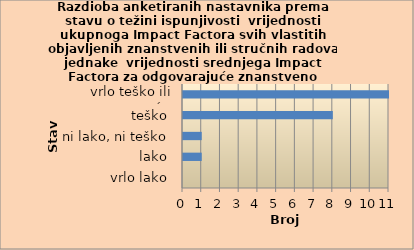
| Category | Series 0 |
|---|---|
| vrlo lako | 0 |
| lako | 1 |
| ni lako, ni teško | 1 |
| teško | 8 |
| vrlo teško ili nemoguće | 11 |